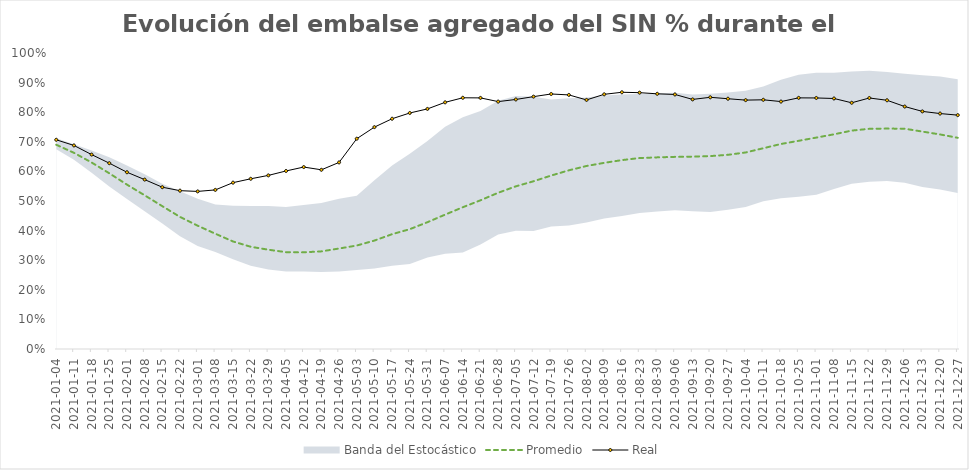
| Category | Promedio | Real |
|---|---|---|
| 2021-01-04 | 0.69 | 0.707 |
| 2021-01-11 | 0.663 | 0.688 |
| 2021-01-18 | 0.63 | 0.657 |
| 2021-01-25 | 0.594 | 0.628 |
| 2021-02-01 | 0.555 | 0.597 |
| 2021-02-08 | 0.519 | 0.572 |
| 2021-02-15 | 0.483 | 0.547 |
| 2021-02-22 | 0.446 | 0.535 |
| 2021-03-01 | 0.416 | 0.532 |
| 2021-03-08 | 0.389 | 0.538 |
| 2021-03-15 | 0.363 | 0.562 |
| 2021-03-22 | 0.345 | 0.575 |
| 2021-03-29 | 0.335 | 0.586 |
| 2021-04-05 | 0.327 | 0.602 |
| 2021-04-12 | 0.327 | 0.615 |
| 2021-04-19 | 0.33 | 0.605 |
| 2021-04-26 | 0.34 | 0.63 |
| 2021-05-03 | 0.35 | 0.71 |
| 2021-05-10 | 0.366 | 0.75 |
| 2021-05-17 | 0.388 | 0.778 |
| 2021-05-24 | 0.405 | 0.797 |
| 2021-05-31 | 0.428 | 0.811 |
| 2021-06-07 | 0.454 | 0.833 |
| 2021-06-14 | 0.479 | 0.849 |
| 2021-06-21 | 0.502 | 0.848 |
| 2021-06-28 | 0.528 | 0.836 |
| 2021-07-05 | 0.55 | 0.843 |
| 2021-07-12 | 0.567 | 0.853 |
| 2021-07-19 | 0.586 | 0.862 |
| 2021-07-26 | 0.604 | 0.858 |
| 2021-08-02 | 0.618 | 0.842 |
| 2021-08-09 | 0.629 | 0.86 |
| 2021-08-16 | 0.638 | 0.867 |
| 2021-08-23 | 0.645 | 0.866 |
| 2021-08-30 | 0.647 | 0.862 |
| 2021-09-06 | 0.649 | 0.86 |
| 2021-09-13 | 0.65 | 0.843 |
| 2021-09-20 | 0.652 | 0.85 |
| 2021-09-27 | 0.656 | 0.845 |
| 2021-10-04 | 0.664 | 0.841 |
| 2021-10-11 | 0.678 | 0.842 |
| 2021-10-18 | 0.693 | 0.836 |
| 2021-10-25 | 0.703 | 0.848 |
| 2021-11-01 | 0.714 | 0.848 |
| 2021-11-08 | 0.725 | 0.846 |
| 2021-11-15 | 0.738 | 0.832 |
| 2021-11-22 | 0.744 | 0.848 |
| 2021-11-29 | 0.745 | 0.84 |
| 2021-12-06 | 0.744 | 0.819 |
| 2021-12-13 | 0.735 | 0.803 |
| 2021-12-20 | 0.725 | 0.795 |
| 2021-12-27 | 0.714 | 0.79 |